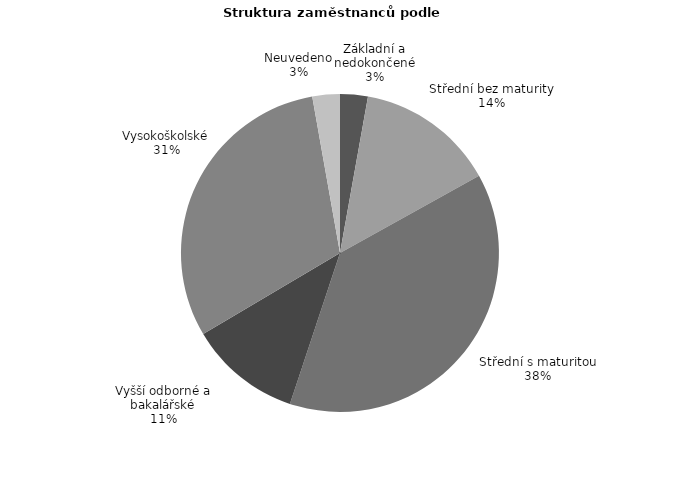
| Category | Series 0 |
|---|---|
| Základní a nedokončené | 18.126 |
| Střední bez maturity | 90.698 |
| Střední s maturitou | 245.267 |
| Vyšší odborné a bakalářské | 73.171 |
| Vysokoškolské | 197.405 |
| Neuvedeno | 17.972 |